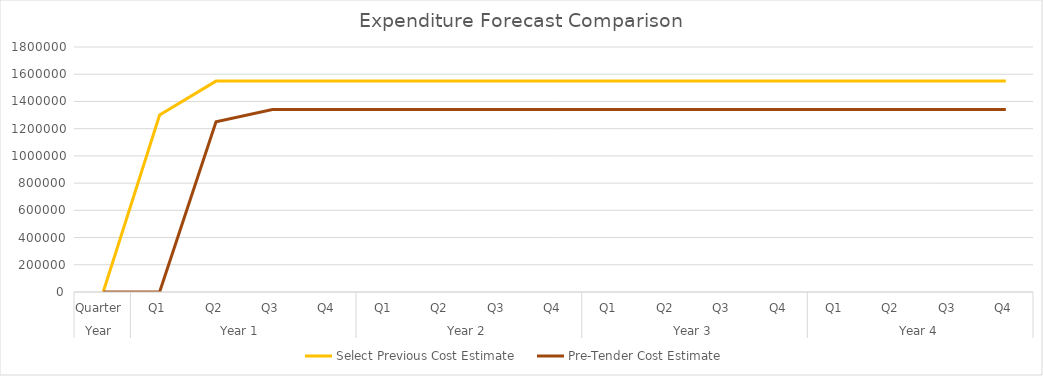
| Category | Select Previous Cost Estimate | Pre-Tender Cost Estimate |
|---|---|---|
| 0 | 0 | 0 |
| 1 | 1300000 | 0 |
| 2 | 1549375 | 1250000 |
| 3 | 1549375 | 1340196.9 |
| 4 | 1549375 | 1340196.9 |
| 5 | 1549375 | 1340196.9 |
| 6 | 1549375 | 1340196.9 |
| 7 | 1549375 | 1340196.9 |
| 8 | 1549375 | 1340196.9 |
| 9 | 1549375 | 1340196.9 |
| 10 | 1549375 | 1340196.9 |
| 11 | 1549375 | 1340196.9 |
| 12 | 1549375 | 1340196.9 |
| 13 | 1549375 | 1340196.9 |
| 14 | 1549375 | 1340196.9 |
| 15 | 1549375 | 1340196.9 |
| 16 | 1549375 | 1340196.9 |